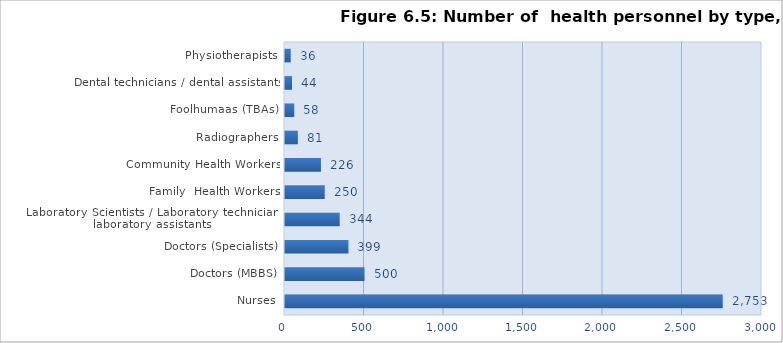
| Category | Series 0 |
|---|---|
| Nurses | 2753 |
| Doctors (MBBS) | 500 |
| Doctors (Specialists) | 399 |
| Laboratory Scientists / Laboratory technicians/ laboratory assistants  | 344 |
| Family  Health Workers | 250 |
| Community Health Workers | 226 |
| Radiographers | 81 |
| Foolhumaas (TBAs) | 58 |
|  Dental technicians / dental assistants | 44 |
| Physiotherapists | 36 |